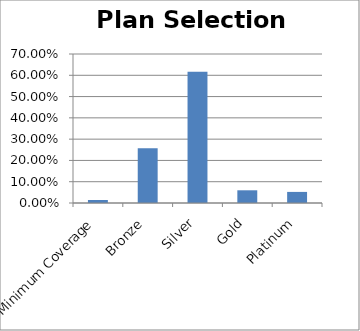
| Category | Distribution |
|---|---|
| Minimum Coverage | 0.014 |
| Bronze | 0.257 |
| Silver | 0.617 |
| Gold | 0.06 |
| Platinum | 0.052 |